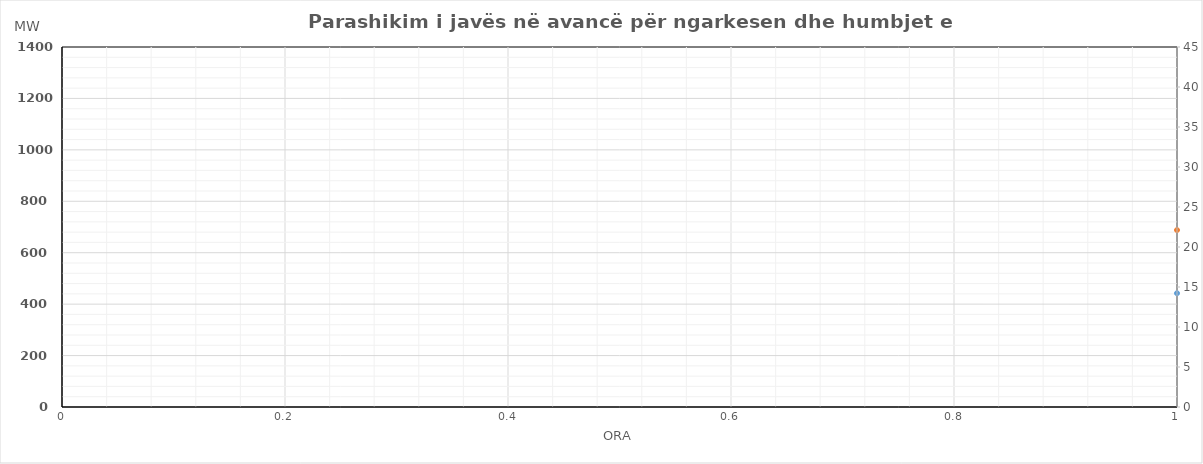
| Category | Ngarkesa (MWh) |
|---|---|
| 0 | 688.053 |
| 1 | 606.964 |
| 2 | 583.087 |
| 3 | 570.63 |
| 4 | 566.507 |
| 5 | 602.776 |
| 6 | 702.934 |
| 7 | 831.755 |
| 8 | 923.383 |
| 9 | 963.583 |
| 10 | 983.019 |
| 11 | 1042.487 |
| 12 | 1054.272 |
| 13 | 1070.196 |
| 14 | 1068.624 |
| 15 | 1074.903 |
| 16 | 1070.046 |
| 17 | 1095.03 |
| 18 | 1122.94 |
| 19 | 1126.895 |
| 20 | 1148.685 |
| 21 | 1136.573 |
| 22 | 1029.822 |
| 23 | 881.667 |
| 24 | 737.18 |
| 25 | 666.5 |
| 26 | 629.02 |
| 27 | 597.22 |
| 28 | 598.91 |
| 29 | 634.12 |
| 30 | 730.25 |
| 31 | 861.38 |
| 32 | 958.11 |
| 33 | 1018.27 |
| 34 | 1047.26 |
| 35 | 1073.03 |
| 36 | 1137.53 |
| 37 | 1158.45 |
| 38 | 1149.44 |
| 39 | 1128.65 |
| 40 | 1106.04 |
| 41 | 1134.06 |
| 42 | 1165.87 |
| 43 | 1158.57 |
| 44 | 1185.7 |
| 45 | 1165.86 |
| 46 | 1050.77 |
| 47 | 896.69 |
| 48 | 779.53 |
| 49 | 702.93 |
| 50 | 662.12 |
| 51 | 643.92 |
| 52 | 635.89 |
| 53 | 667.38 |
| 54 | 762.72 |
| 55 | 885.92 |
| 56 | 998.59 |
| 57 | 1055.53 |
| 58 | 1086.06 |
| 59 | 1123.87 |
| 60 | 1146.14 |
| 61 | 1168.41 |
| 62 | 1158.25 |
| 63 | 1149.76 |
| 64 | 1149.62 |
| 65 | 1176.76 |
| 66 | 1207.51 |
| 67 | 1207.49 |
| 68 | 1223.36 |
| 69 | 1217.94 |
| 70 | 1117.47 |
| 71 | 956.45 |
| 72 | 791.97 |
| 73 | 718.87 |
| 74 | 676.69 |
| 75 | 656.19 |
| 76 | 646.07 |
| 77 | 670.93 |
| 78 | 764.77 |
| 79 | 872.34 |
| 80 | 989.58 |
| 81 | 1044.6 |
| 82 | 1081.63 |
| 83 | 1115.65 |
| 84 | 1150.36 |
| 85 | 1177.56 |
| 86 | 1169.66 |
| 87 | 1166.41 |
| 88 | 1151.54 |
| 89 | 1180.53 |
| 90 | 1208.96 |
| 91 | 1200.73 |
| 92 | 1215.96 |
| 93 | 1213.59 |
| 94 | 1122.16 |
| 95 | 954.77 |
| 96 | 778.38 |
| 97 | 704.75 |
| 98 | 661.82 |
| 99 | 641.84 |
| 100 | 633.42 |
| 101 | 659.7 |
| 102 | 753.32 |
| 103 | 886.55 |
| 104 | 999.65 |
| 105 | 1056.44 |
| 106 | 1086.66 |
| 107 | 1120.05 |
| 108 | 1146.14 |
| 109 | 1169.12 |
| 110 | 1158.24 |
| 111 | 1147.19 |
| 112 | 1134.3 |
| 113 | 1160.74 |
| 114 | 1190.54 |
| 115 | 1194.25 |
| 116 | 1205.78 |
| 117 | 1198.88 |
| 118 | 1089.98 |
| 119 | 927.68 |
| 120 | 804.36 |
| 121 | 724.43 |
| 122 | 683.6 |
| 123 | 664.31 |
| 124 | 664.49 |
| 125 | 675.07 |
| 126 | 759.39 |
| 127 | 889.12 |
| 128 | 992.82 |
| 129 | 1057.42 |
| 130 | 1099.06 |
| 131 | 1120.45 |
| 132 | 1141.74 |
| 133 | 1160.12 |
| 134 | 1151.64 |
| 135 | 1140.99 |
| 136 | 1139.5 |
| 137 | 1163.24 |
| 138 | 1185.24 |
| 139 | 1184.02 |
| 140 | 1194.35 |
| 141 | 1181.55 |
| 142 | 1071.25 |
| 143 | 919.35 |
| 144 | 812.56 |
| 145 | 729.23 |
| 146 | 687.9 |
| 147 | 664.91 |
| 148 | 657.99 |
| 149 | 675.17 |
| 150 | 754.99 |
| 151 | 846.62 |
| 152 | 930.72 |
| 153 | 983.32 |
| 154 | 1003.76 |
| 155 | 1029.75 |
| 156 | 1062.34 |
| 157 | 1068.22 |
| 158 | 1044.24 |
| 159 | 1059.19 |
| 160 | 1088.8 |
| 161 | 1137.74 |
| 162 | 1195.34 |
| 163 | 1213.42 |
| 164 | 1235.65 |
| 165 | 1242.05 |
| 166 | 1130.55 |
| 167 | 977.45 |